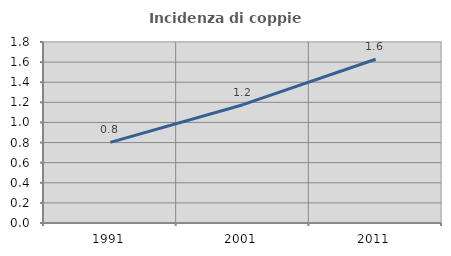
| Category | Incidenza di coppie miste |
|---|---|
| 1991.0 | 0.802 |
| 2001.0 | 1.176 |
| 2011.0 | 1.628 |